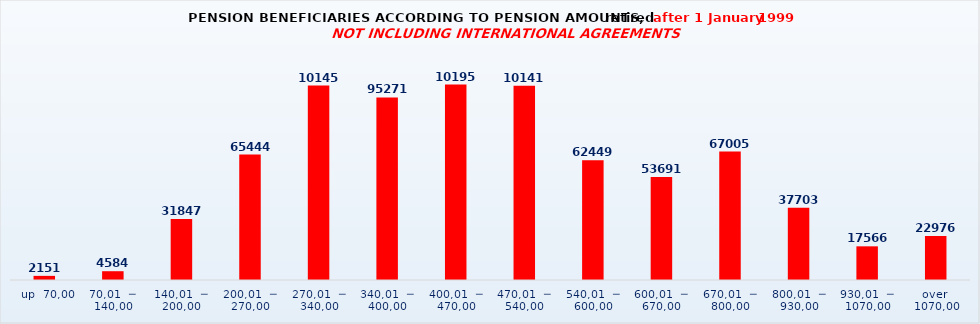
| Category | Series 0 |
|---|---|
|   up  70,00 | 2151 |
| 70,01  ─  140,00 | 4584 |
| 140,01  ─  200,00 | 31847 |
| 200,01  ─  270,00 | 65444 |
| 270,01  ─  340,00 | 101458 |
| 340,01  ─  400,00 | 95271 |
| 400,01  ─  470,00 | 101959 |
| 470,01  ─  540,00 | 101411 |
| 540,01  ─  600,00 | 62449 |
| 600,01  ─  670,00 | 53691 |
| 670,01  ─  800,00 | 67005 |
| 800,01  ─  930,00 | 37703 |
| 930,01  ─  1070,00 | 17566 |
| over  1070,00 | 22976 |